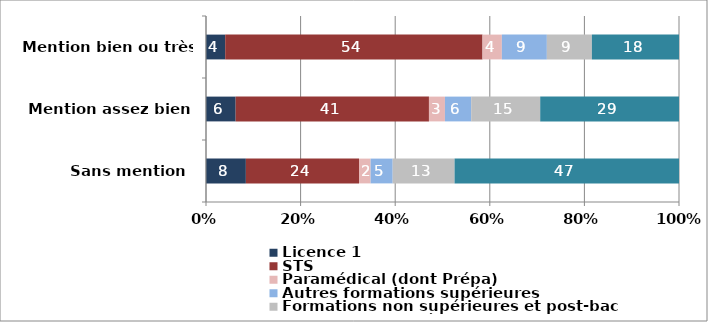
| Category | Licence 1 | STS | Paramédical (dont Prépa) | Autres formations supérieures | Formations non supérieures et post-bac | Non-poursuite d'études |
|---|---|---|---|---|---|---|
| Sans mention  | 8.43 | 23.92 | 2.45 | 4.67 | 13.08 | 47.45 |
| Mention assez bien | 6.27 | 40.86 | 3.38 | 5.55 | 14.59 | 29.34 |
| Mention bien ou très bien | 4.05 | 54.25 | 4.08 | 9.49 | 9.49 | 18.37 |